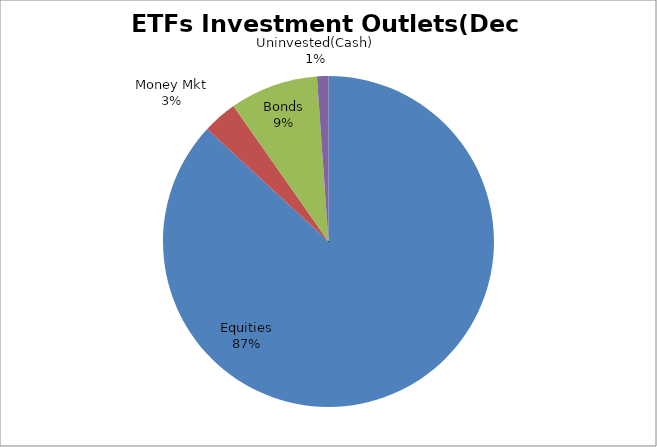
| Category | Series 0 |
|---|---|
| Equities | 4593226725.97 |
| Money Mkt | 177224498.42 |
| Bonds | 455822889.82 |
| Uninvested(Cash) | 58868504.36 |